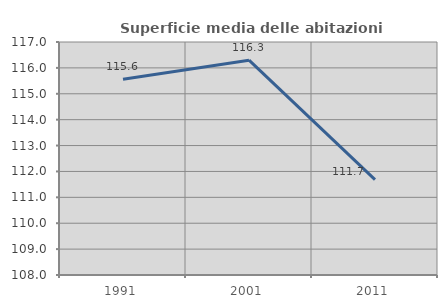
| Category | Superficie media delle abitazioni occupate |
|---|---|
| 1991.0 | 115.561 |
| 2001.0 | 116.297 |
| 2011.0 | 111.684 |